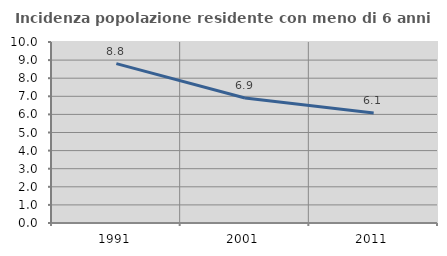
| Category | Incidenza popolazione residente con meno di 6 anni |
|---|---|
| 1991.0 | 8.805 |
| 2001.0 | 6.908 |
| 2011.0 | 6.074 |